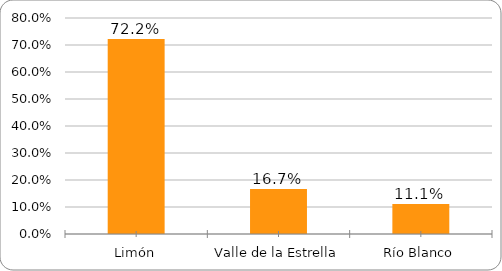
| Category | Series 0 |
|---|---|
| Limón | 0.722 |
| Valle de la Estrella | 0.167 |
| Río Blanco | 0.111 |